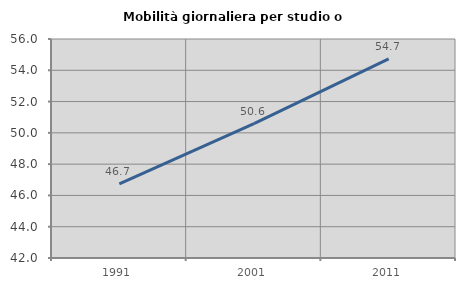
| Category | Mobilità giornaliera per studio o lavoro |
|---|---|
| 1991.0 | 46.739 |
| 2001.0 | 50.592 |
| 2011.0 | 54.728 |